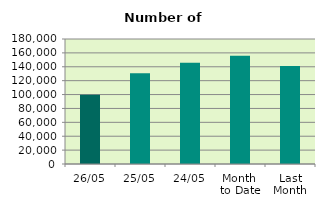
| Category | Series 0 |
|---|---|
| 26/05 | 99620 |
| 25/05 | 130530 |
| 24/05 | 145890 |
| Month 
to Date | 156019.789 |
| Last
Month | 140978.316 |